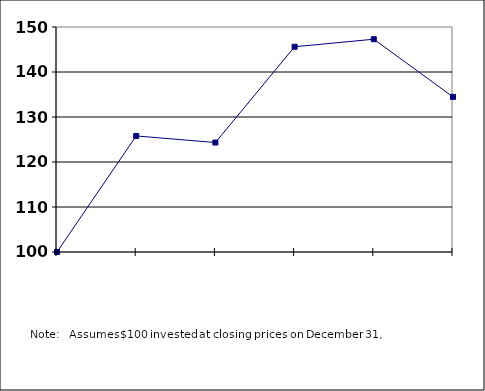
| Category | Series 0 |
|---|---|
| nan | 100 |
| 2019.0 | 125.789 |
| 2020.0 | 124.326 |
| 2021.0 | 145.608 |
| 2022.0 | 147.287 |
| 2023.0 | 134.473 |